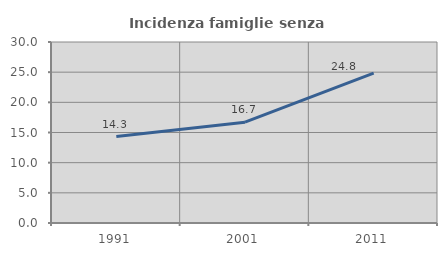
| Category | Incidenza famiglie senza nuclei |
|---|---|
| 1991.0 | 14.327 |
| 2001.0 | 16.711 |
| 2011.0 | 24.837 |